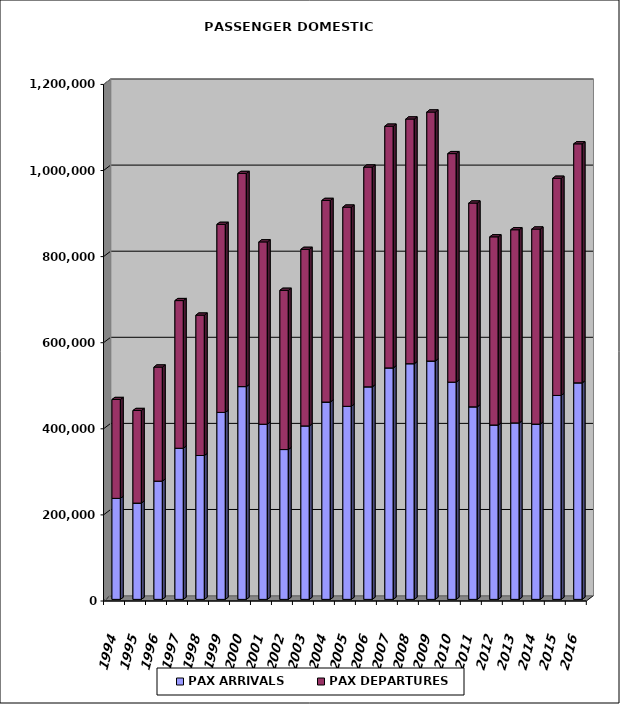
| Category | PAX ARRIVALS | PAX DEPARTURES |
|---|---|---|
| 1994.0 | 234655 | 229642 |
| 1995.0 | 223649 | 215067 |
| 1996.0 | 274682 | 265003 |
| 1997.0 | 351085 | 342985 |
| 1998.0 | 334247 | 326077 |
| 1999.0 | 434343 | 436757 |
| 2000.0 | 494317 | 495079 |
| 2001.0 | 406885 | 423563 |
| 2002.0 | 348053 | 369881 |
| 2003.0 | 403032 | 410025 |
| 2004.0 | 458373 | 468323 |
| 2005.0 | 448461 | 462746 |
| 2006.0 | 493760 | 510463 |
| 2007.0 | 537718 | 561478 |
| 2008.0 | 547484 | 568439 |
| 2009.0 | 553679 | 578455 |
| 2010.0 | 504633 | 530860 |
| 2011.0 | 447279 | 473357 |
| 2012.0 | 405104 | 437104 |
| 2013.0 | 409981 | 448668 |
| 2014.0 | 407162 | 453081 |
| 2015.0 | 473771 | 504426 |
| 2016.0 | 503021 | 555196 |